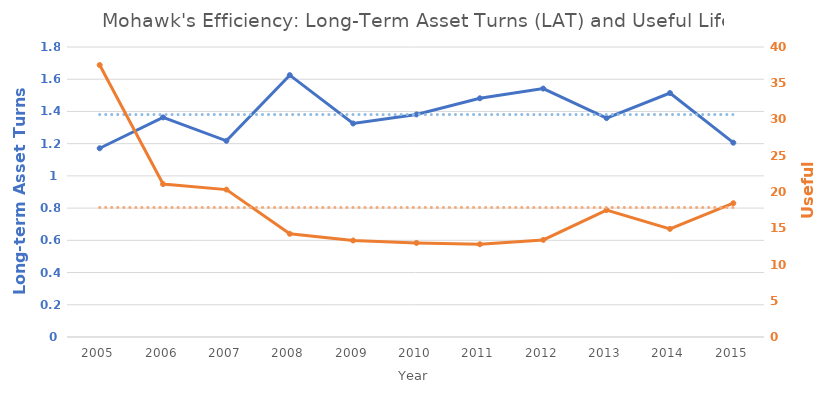
| Category | LAT | LAT (Average) |
|---|---|---|
| 2005.0 | 1.171 | 1.381 |
| 2006.0 | 1.363 | 1.381 |
| 2007.0 | 1.218 | 1.381 |
| 2008.0 | 1.625 | 1.381 |
| 2009.0 | 1.325 | 1.381 |
| 2010.0 | 1.381 | 1.381 |
| 2011.0 | 1.482 | 1.381 |
| 2012.0 | 1.542 | 1.381 |
| 2013.0 | 1.359 | 1.381 |
| 2014.0 | 1.514 | 1.381 |
| 2015.0 | 1.206 | 1.381 |